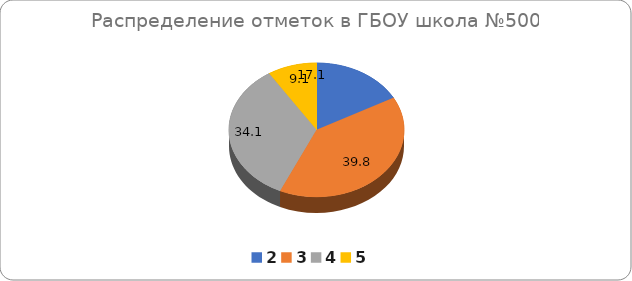
| Category | ГБОУ СОШ №500 |
|---|---|
| 2.0 | 17.05 |
| 3.0 | 39.77 |
| 4.0 | 34.09 |
| 5.0 | 9.09 |